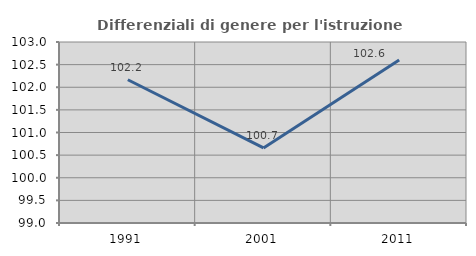
| Category | Differenziali di genere per l'istruzione superiore |
|---|---|
| 1991.0 | 102.166 |
| 2001.0 | 100.66 |
| 2011.0 | 102.6 |